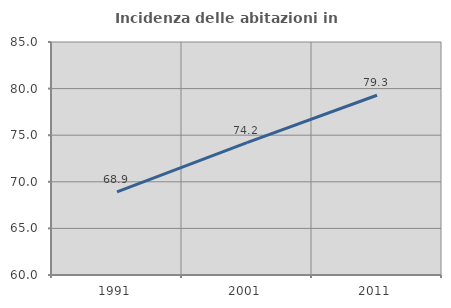
| Category | Incidenza delle abitazioni in proprietà  |
|---|---|
| 1991.0 | 68.926 |
| 2001.0 | 74.21 |
| 2011.0 | 79.29 |